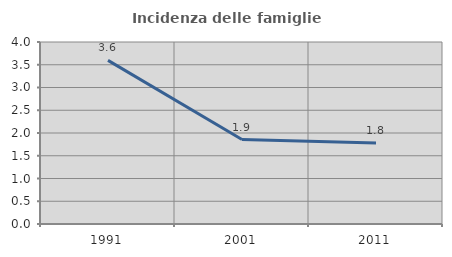
| Category | Incidenza delle famiglie numerose |
|---|---|
| 1991.0 | 3.597 |
| 2001.0 | 1.857 |
| 2011.0 | 1.782 |